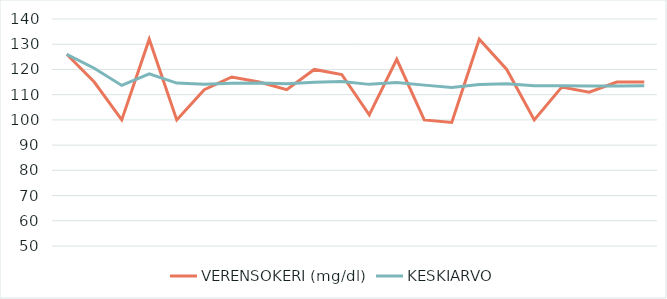
| Category | VERENSOKERI (mg/dl) | KESKIARVO |
|---|---|---|
| 0 | 126 | 126 |
| 1 | 115 | 120.5 |
| 2 | 100 | 113.667 |
| 3 | 132 | 118.25 |
| 4 | 100 | 114.6 |
| 5 | 112 | 114.167 |
| 6 | 117 | 114.571 |
| 7 | 115 | 114.625 |
| 8 | 112 | 114.333 |
| 9 | 120 | 114.9 |
| 10 | 118 | 115.182 |
| 11 | 102 | 114.083 |
| 12 | 124 | 114.846 |
| 13 | 100 | 113.786 |
| 14 | 99 | 112.8 |
| 15 | 132 | 114 |
| 16 | 120 | 114.353 |
| 17 | 100 | 113.556 |
| 18 | 113 | 113.526 |
| 19 | 111 | 113.4 |
| 20 | 115 | 113.476 |
| 21 | 115 | 113.545 |